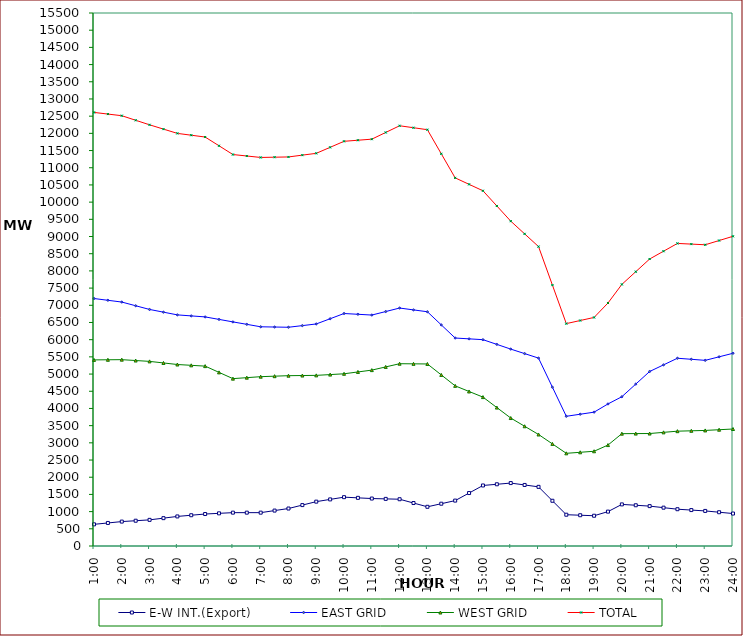
| Category | E-W INT.(Export) | EAST GRID | WEST GRID | TOTAL |
|---|---|---|---|---|
| 1:00 | 630 | 7197 | 5412 | 12609 |
| 1:30 | 670 | 7145.5 | 5415.5 | 12561 |
| 2:00 | 710 | 7094 | 5419 | 12513 |
| 2:30 | 735 | 6986.5 | 5394 | 12380.5 |
| 3:00 | 760 | 6879 | 5369 | 12248 |
| 3:30 | 810 | 6800 | 5323.5 | 12123.5 |
| 4:00 | 860 | 6721 | 5278 | 11999 |
| 4:30 | 895 | 6691.5 | 5254.5 | 11946 |
| 5:00 | 930 | 6662 | 5231 | 11893 |
| 5:30 | 950 | 6589.5 | 5049 | 11638.5 |
| 6:00 | 970 | 6517 | 4867 | 11384 |
| 6:30 | 970 | 6446 | 4895.5 | 11341.5 |
| 7:00 | 970 | 6375 | 4924 | 11299 |
| 7:30 | 1030 | 6368 | 4938.5 | 11306.5 |
| 8:00 | 1090 | 6361 | 4953 | 11314 |
| 8:30 | 1190 | 6409 | 4957.5 | 11366.5 |
| 9:00 | 1290 | 6457 | 4962 | 11419 |
| 9:30 | 1355 | 6609 | 4985 | 11594 |
| 10:00 | 1420 | 6761 | 5008 | 11769 |
| 10:30 | 1400 | 6738.5 | 5061.5 | 11800 |
| 11:00 | 1380 | 6716 | 5115 | 11831 |
| 11:30 | 1370 | 6818 | 5208 | 12026 |
| 12:00 | 1360 | 6920 | 5301 | 12221 |
| 12:30 | 1250 | 6866 | 5297.5 | 12163.5 |
| 13:00 | 1140 | 6812 | 5294 | 12106 |
| 13:30 | 1230 | 6430 | 4975.5 | 11405.5 |
| 14:00 | 1320 | 6048 | 4657 | 10705 |
| 14:30 | 1540 | 6024 | 4493.5 | 10517.5 |
| 15:00 | 1760 | 6000 | 4330 | 10330 |
| 15:30 | 1795 | 5863 | 4025.5 | 9888.5 |
| 16:00 | 1830 | 5726 | 3721 | 9447 |
| 16:30 | 1775 | 5595 | 3482 | 9077 |
| 17:00 | 1720 | 5464 | 3243 | 8707 |
| 17:30 | 1315 | 4618 | 2969 | 7587 |
| 18:00 | 910 | 3772 | 2695 | 6467 |
| 18:30 | 895 | 3832 | 2725 | 6557 |
| 19:00 | 880 | 3892 | 2755 | 6647 |
| 19:30 | 1000 | 4131 | 2935 | 7066 |
| 20:00 | 1210 | 4341 | 3267 | 7608 |
| 20:30 | 1185 | 4708 | 3269 | 7977 |
| 21:00 | 1160 | 5075 | 3271 | 8346 |
| 21:30 | 1115 | 5267.5 | 3305 | 8572.5 |
| 22:00 | 1070 | 5460 | 3339 | 8799 |
| 22:30 | 1045 | 5429.5 | 3350 | 8779.5 |
| 23:00 | 1020 | 5399 | 3361 | 8760 |
| 23:30 | 982 | 5501.5 | 3381.5 | 8883 |
| 24:00 | 944 | 5604 | 3402 | 9006 |